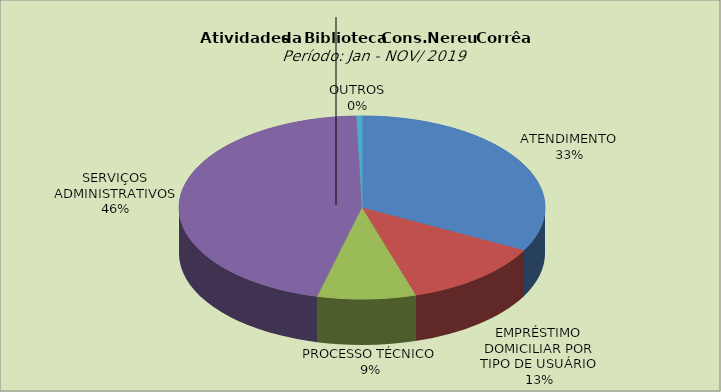
| Category | Series 0 |
|---|---|
| ATENDIMENTO | 32.723 |
| EMPRÉSTIMO DOMICILIAR POR TIPO DE USUÁRIO | 12.544 |
| PROCESSO TÉCNICO | 8.662 |
| SERVIÇOS ADMINISTRATIVOS | 45.576 |
| OUTROS | 0.495 |